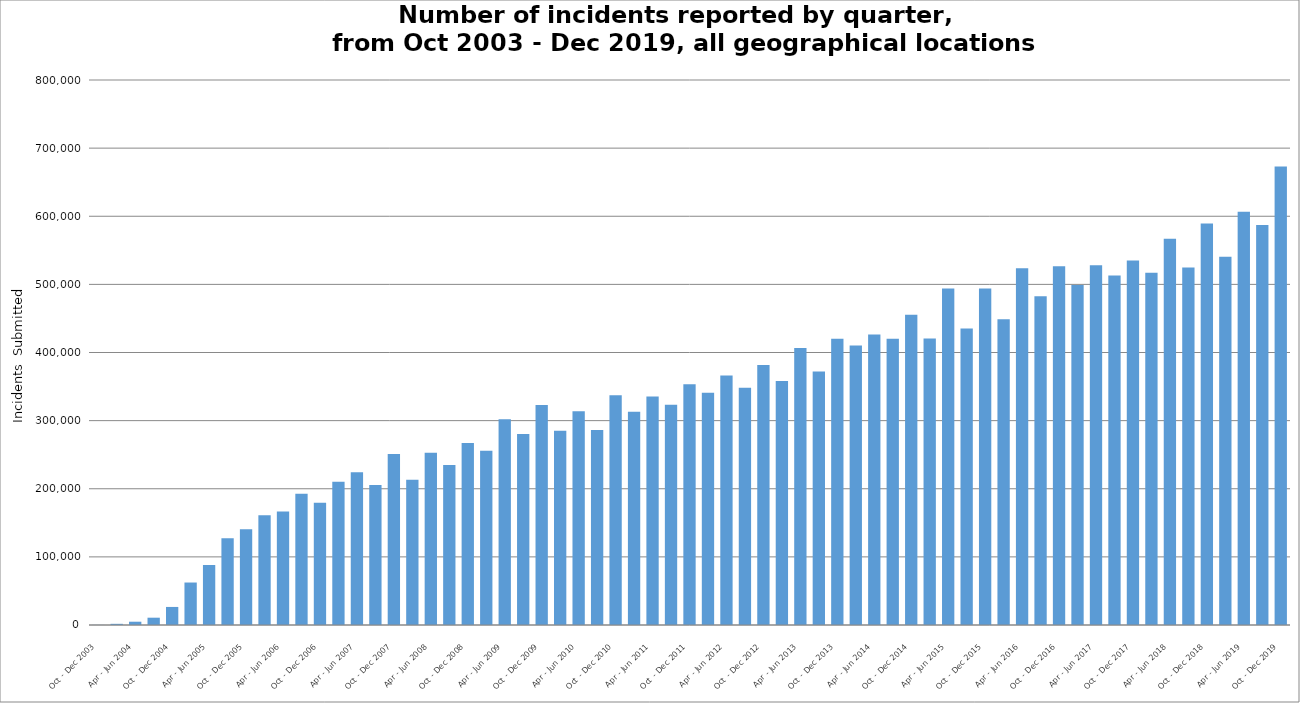
| Category | *All geographical locations |
|---|---|
| Oct - Dec 2003 | 158 |
| Jan - Mar 2004 | 1716 |
| Apr - Jun 2004 | 4823 |
| Jul - Sep 2004 | 10720 |
| Oct - Dec 2004 | 26508 |
| Jan - Mar 2005 | 62351 |
| Apr - Jun 2005 | 88042 |
| Jul - Sep 2005 | 127170 |
| Oct - Dec 2005 | 140394 |
| Jan - Mar 2006 | 161141 |
| Apr - Jun 2006 | 166539 |
| Jul - Sep 2006 | 192794 |
| Oct - Dec 2006 | 179538 |
| Jan - Mar 2007 | 210178 |
| Apr - Jun 2007 | 224047 |
| Jul - Sep 2007 | 205357 |
| Oct - Dec 2007 | 251010 |
| Jan - Mar 2008 | 213281 |
| Apr - Jun 2008 | 253006 |
| Jul - Sep 2008 | 234863 |
| Oct - Dec 2008 | 267135 |
| Jan - Mar 2009 | 255837 |
| Apr - Jun 2009 | 302198 |
| Jul - Sep 2009 | 280454 |
| Oct - Dec 2009 | 322757 |
| Jan - Mar 2010 | 284962 |
| Apr - Jun 2010 | 313827 |
| Jul - Sep 2010 | 286096 |
| Oct - Dec 2010 | 337149 |
| Jan - Mar 2011 | 312982 |
| Apr - Jun 2011 | 335327 |
| Jul - Sep 2011 | 323427 |
| Oct - Dec 2011 | 353578 |
| Jan - Mar 2012 | 340826 |
| Apr - Jun 2012 | 366262 |
| Jul - Sep 2012 | 348341 |
| Oct - Dec 2012 | 381754 |
| Jan - Mar 2013 | 358099 |
| Apr - Jun 2013 | 406617 |
| Jul - Sep 2013 | 372099 |
| Oct - Dec 2013 | 420297 |
| Jan - Mar 2014 | 410408 |
| Apr - Jun 2014 | 426315 |
| Jul - Sep 2014 | 420333 |
| Oct - Dec 2014 | 455584 |
| Jan - Mar 2015 | 420510 |
| Apr - Jun 2015 | 493795 |
| Jul - Sep 2015 | 435245 |
| Oct - Dec 2015 | 494082 |
| Jan - Mar 2016 | 448659 |
| Apr - Jun 2016 | 523610 |
| Jul - Sep 2016 | 482727 |
| Oct - Dec 2016 | 526580 |
| Jan - Mar 2017 | 499023 |
| Apr - Jun 2017 | 528164 |
| Jul - Sep 2017 | 513153 |
| Oct - Dec 2017 | 535229 |
| Jan - Mar 2018 | 516918 |
| Apr - Jun 2018 | 566898 |
| Jul - Sep 2018 | 524805 |
| Oct - Dec 2018 | 589471 |
| Jan - Mar 2019 | 540731 |
| Apr - Jun 2019 | 606613 |
| Jul - Sep 2019 | 586993 |
| Oct - Dec 2019 | 672985 |